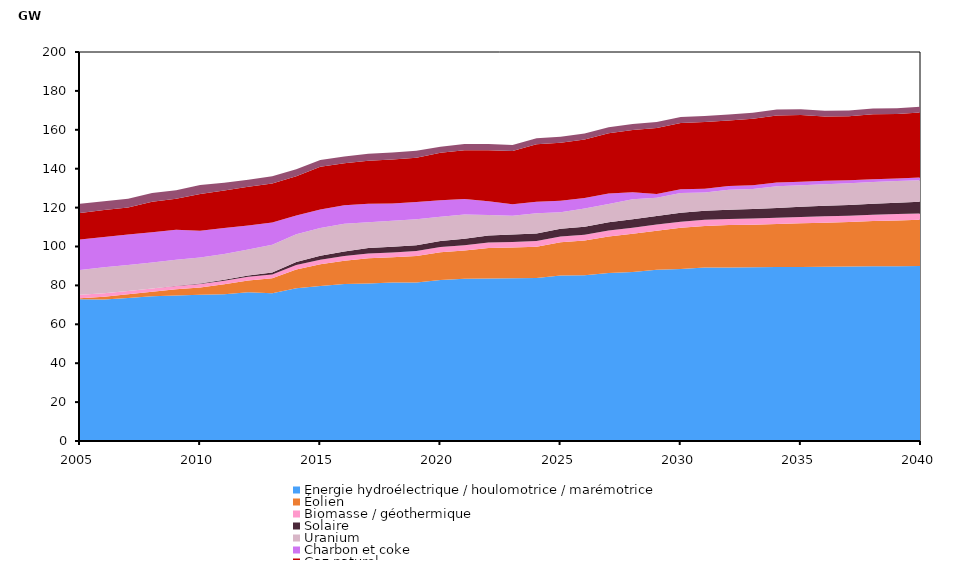
| Category | Énergie hydroélectrique / houlomotrice / marémotrice | Éolien | Biomasse / géothermique | Solaire | Uranium | Charbon et coke | Gaz naturel | Pétrole |
|---|---|---|---|---|---|---|---|---|
| 2005.0 | 72.878 | 0.557 | 1.708 | 0.017 | 12.805 | 15.648 | 13.561 | 4.77 |
| 2006.0 | 72.768 | 1.443 | 1.715 | 0.02 | 13.345 | 15.564 | 13.859 | 4.519 |
| 2007.0 | 73.569 | 1.823 | 1.715 | 0.026 | 13.345 | 15.651 | 13.955 | 4.524 |
| 2008.0 | 74.472 | 2.321 | 1.639 | 0.033 | 13.345 | 15.472 | 15.717 | 4.521 |
| 2009.0 | 74.754 | 3.24 | 1.708 | 0.095 | 13.345 | 15.529 | 15.82 | 4.475 |
| 2010.0 | 75.149 | 3.746 | 1.773 | 0.281 | 13.345 | 13.78 | 18.945 | 4.609 |
| 2011.0 | 75.465 | 5.171 | 1.802 | 0.419 | 13.345 | 13.254 | 19.355 | 3.916 |
| 2012.0 | 76.52 | 6.038 | 1.858 | 0.647 | 13.345 | 12.42 | 19.891 | 3.641 |
| 2013.0 | 75.991 | 7.684 | 1.886 | 1.028 | 14.345 | 11.446 | 20.066 | 3.645 |
| 2014.0 | 78.565 | 9.622 | 2.342 | 1.523 | 14.273 | 9.615 | 20.153 | 3.656 |
| 2015.0 | 79.677 | 11.162 | 2.318 | 2.135 | 14.273 | 9.491 | 21.931 | 3.501 |
| 2016.0 | 80.728 | 11.983 | 2.385 | 2.307 | 14.273 | 9.491 | 21.577 | 3.559 |
| 2017.0 | 81.012 | 12.89 | 2.465 | 2.805 | 13.338 | 9.491 | 22.097 | 3.595 |
| 2018.0 | 81.474 | 12.998 | 2.477 | 2.926 | 13.338 | 8.903 | 22.576 | 3.615 |
| 2019.0 | 81.524 | 13.623 | 2.519 | 3.011 | 13.338 | 8.903 | 22.737 | 3.625 |
| 2020.0 | 82.811 | 14.192 | 2.726 | 3.073 | 12.513 | 8.495 | 24.402 | 3.135 |
| 2021.0 | 83.456 | 14.432 | 2.789 | 3.248 | 12.513 | 7.95 | 25.132 | 3.135 |
| 2022.0 | 83.516 | 15.686 | 2.824 | 3.688 | 10.498 | 7.005 | 26.292 | 3.135 |
| 2023.0 | 83.667 | 15.782 | 2.919 | 3.777 | 9.673 | 5.853 | 27.372 | 3.091 |
| 2024.0 | 83.814 | 16.034 | 2.925 | 3.873 | 10.498 | 5.853 | 29.521 | 3.105 |
| 2025.0 | 85.077 | 17.093 | 2.972 | 4.029 | 8.451 | 5.853 | 29.807 | 3.102 |
| 2026.0 | 85.208 | 17.842 | 3.008 | 4.146 | 9.386 | 5.404 | 30.065 | 3.07 |
| 2027.0 | 86.415 | 18.715 | 3.054 | 4.233 | 9.389 | 5.404 | 31.035 | 3.07 |
| 2028.0 | 86.939 | 19.642 | 3.109 | 4.318 | 10.229 | 3.634 | 31.975 | 3.074 |
| 2029.0 | 88.037 | 20.098 | 3.124 | 4.43 | 9.407 | 1.951 | 33.88 | 3.043 |
| 2030.0 | 88.487 | 21.139 | 3.147 | 4.523 | 10.247 | 1.951 | 34.03 | 3.048 |
| 2031.0 | 89.181 | 21.413 | 3.153 | 4.625 | 9.425 | 1.951 | 34.24 | 3.053 |
| 2032.0 | 89.256 | 21.744 | 3.158 | 4.751 | 10.265 | 1.951 | 33.655 | 3.057 |
| 2033.0 | 89.341 | 21.89 | 3.214 | 4.867 | 10.265 | 1.951 | 34.137 | 3.057 |
| 2034.0 | 89.396 | 22.225 | 3.224 | 4.989 | 11.105 | 1.951 | 34.488 | 3.057 |
| 2035.0 | 89.491 | 22.463 | 3.23 | 5.227 | 11.105 | 1.795 | 34.32 | 2.99 |
| 2036.0 | 89.545 | 22.713 | 3.236 | 5.413 | 11.105 | 1.795 | 33.023 | 2.994 |
| 2037.0 | 89.698 | 22.865 | 3.243 | 5.59 | 11.105 | 1.519 | 32.968 | 2.994 |
| 2038.0 | 89.787 | 23.291 | 3.257 | 5.671 | 11.105 | 1.519 | 33.378 | 2.994 |
| 2039.0 | 89.88 | 23.551 | 3.264 | 5.846 | 11.105 | 1.364 | 33.058 | 2.994 |
| 2040.0 | 89.915 | 23.813 | 3.271 | 6.021 | 11.105 | 1.364 | 33.428 | 2.994 |